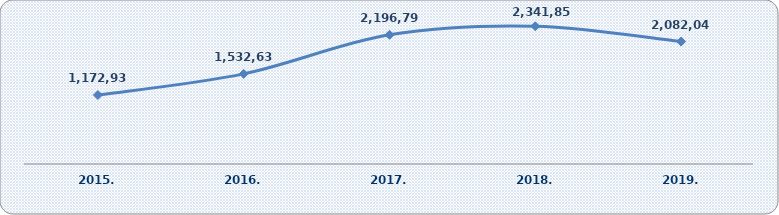
| Category | Dobit razdoblja (+) ili gubitak razdoblja (-) |
|---|---|
| 2015. | 1172934.297 |
| 2016. | 1532629.599 |
| 2017. | 2196795.191 |
| 2018. | 2341855.71 |
| 2019. | 2082043.648 |